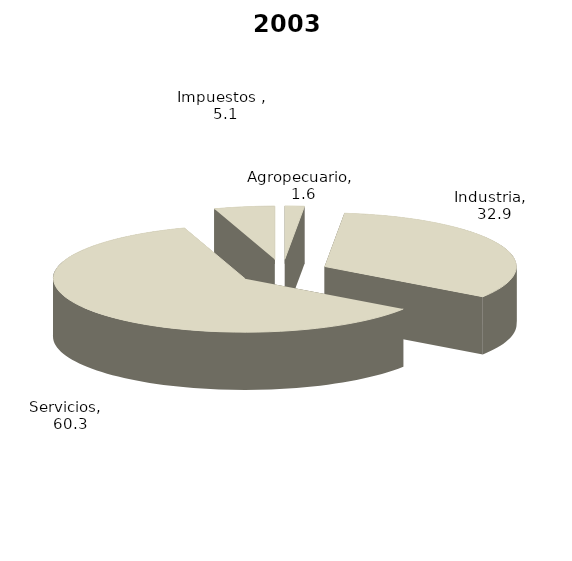
| Category | 2003 |
|---|---|
| Agropecuario | 1.642 |
| Industria | 32.945 |
| Servicios | 60.303 |
| Impuestos  | 5.11 |